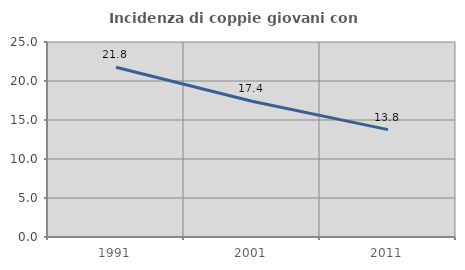
| Category | Incidenza di coppie giovani con figli |
|---|---|
| 1991.0 | 21.763 |
| 2001.0 | 17.402 |
| 2011.0 | 13.768 |